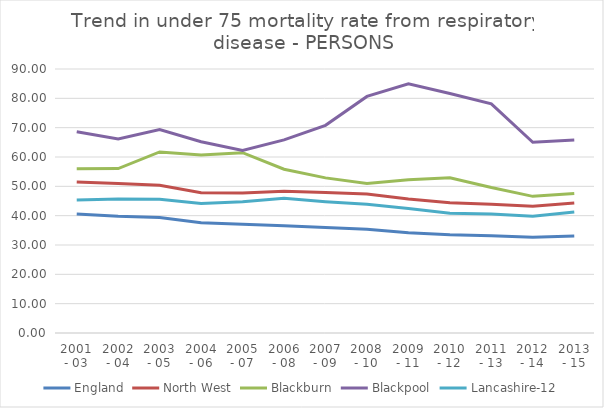
| Category | England | North West | Blackburn | Blackpool | Lancashire-12 |
|---|---|---|---|---|---|
| 2001 - 03 | 40.535 | 51.502 | 56.026 | 68.642 | 45.301 |
| 2002 - 04 | 39.801 | 50.95 | 56.069 | 66.182 | 45.648 |
| 2003 - 05 | 39.385 | 50.359 | 61.714 | 69.382 | 45.571 |
| 2004 - 06 | 37.614 | 47.832 | 60.702 | 65.194 | 44.114 |
| 2005 - 07 | 37.05 | 47.727 | 61.472 | 62.251 | 44.766 |
| 2006 - 08 | 36.546 | 48.298 | 55.823 | 65.821 | 45.899 |
| 2007 - 09 | 36.005 | 47.867 | 52.882 | 70.794 | 44.723 |
| 2008 - 10 | 35.343 | 47.362 | 50.946 | 80.65 | 43.86 |
| 2009 - 11 | 34.218 | 45.673 | 52.209 | 84.979 | 42.429 |
| 2010 - 12 | 33.524 | 44.375 | 52.942 | 81.642 | 40.844 |
| 2011 - 13 | 33.174 | 43.852 | 49.593 | 78.12 | 40.549 |
| 2012 - 14 | 32.622 | 43.204 | 46.588 | 65.036 | 39.825 |
| 2013 - 15 | 33.067 | 44.31 | 47.587 | 65.781 | 41.248 |